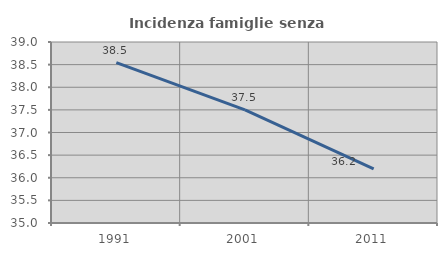
| Category | Incidenza famiglie senza nuclei |
|---|---|
| 1991.0 | 38.545 |
| 2001.0 | 37.5 |
| 2011.0 | 36.196 |